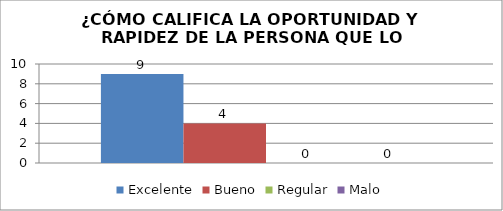
| Category | Excelente | Bueno | Regular | Malo |
|---|---|---|---|---|
| 0 | 9 | 4 | 0 | 0 |